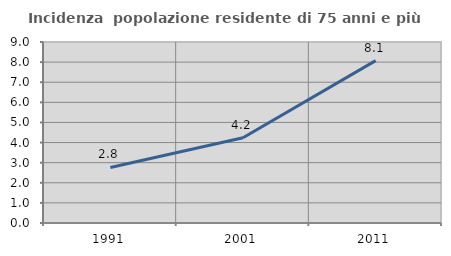
| Category | Incidenza  popolazione residente di 75 anni e più |
|---|---|
| 1991.0 | 2.76 |
| 2001.0 | 4.241 |
| 2011.0 | 8.072 |